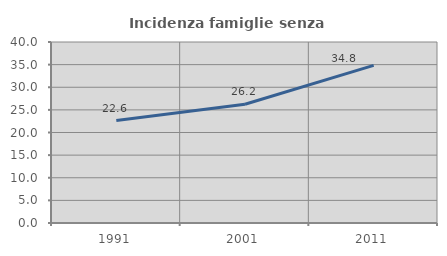
| Category | Incidenza famiglie senza nuclei |
|---|---|
| 1991.0 | 22.636 |
| 2001.0 | 26.242 |
| 2011.0 | 34.835 |